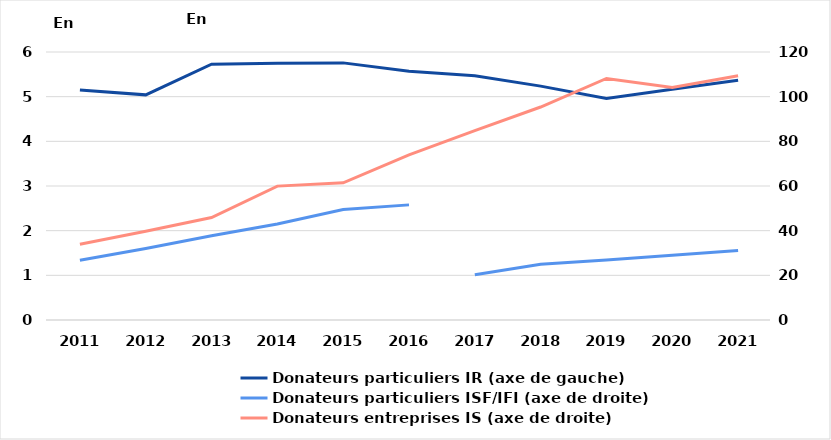
| Category | Donateurs particuliers IR (axe de gauche) |
|---|---|
| 2011.0 | 5.147 |
| 2012.0 | 5.041 |
| 2013.0 | 5.727 |
| 2014.0 | 5.748 |
| 2015.0 | 5.756 |
| 2016.0 | 5.567 |
| 2017.0 | 5.47 |
| 2018.0 | 5.236 |
| 2019.0 | 4.962 |
| 2020.0 | 5.166 |
| 2021.0 | 5.367 |